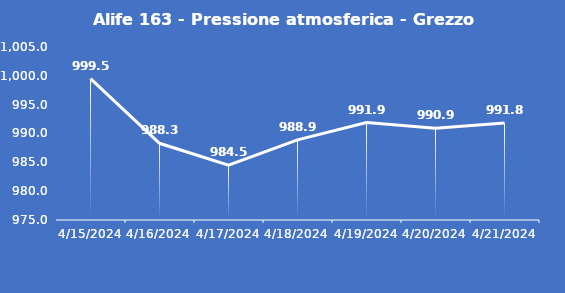
| Category | Alife 163 - Pressione atmosferica - Grezzo (hPa) |
|---|---|
| 4/15/24 | 999.5 |
| 4/16/24 | 988.3 |
| 4/17/24 | 984.5 |
| 4/18/24 | 988.9 |
| 4/19/24 | 991.9 |
| 4/20/24 | 990.9 |
| 4/21/24 | 991.8 |